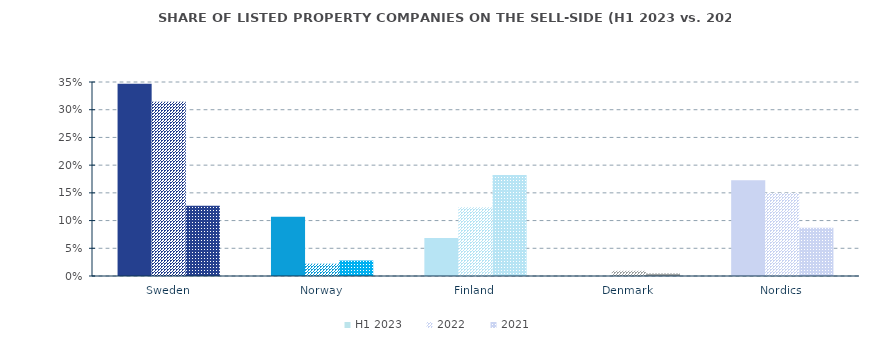
| Category | H1 2023 | 2022 | 2021 |
|---|---|---|---|
| Sweden | 0.347 | 0.314 | 0.127 |
| Norway | 0.107 | 0.022 | 0.028 |
| Finland | 0.069 | 0.124 | 0.182 |
| Denmark | 0 | 0.009 | 0.005 |
| Nordics | 0.173 | 0.15 | 0.087 |